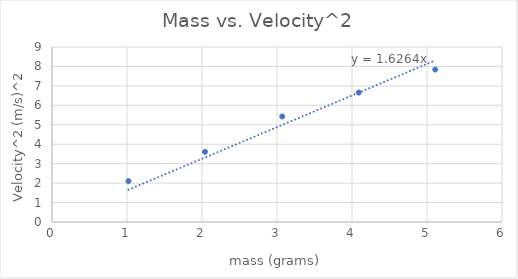
| Category | Series 0 |
|---|---|
| 1.02 | 2.102 |
| 2.04 | 3.61 |
| 3.07 | 5.429 |
| 4.09 | 6.656 |
| 5.11 | 7.84 |